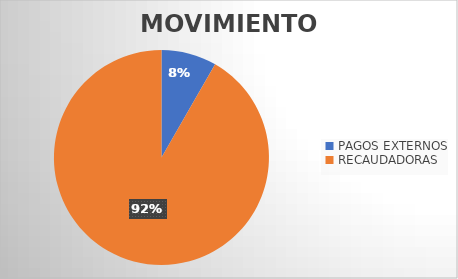
| Category | MOVIMIENTOS |
|---|---|
| PAGOS EXTERNOS | 8397 |
| RECAUDADORAS | 92632 |